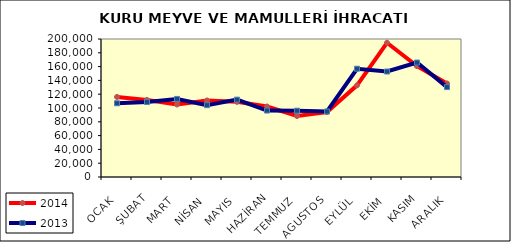
| Category | 2014 | 2013 |
|---|---|---|
| OCAK | 116017.897 | 106856.598 |
| ŞUBAT | 111650.12 | 108712.616 |
| MART | 105105.683 | 113139.691 |
| NİSAN | 110911.075 | 104112.964 |
| MAYIS | 108931.17 | 112100.792 |
| HAZİRAN | 102183.278 | 96319.293 |
| TEMMUZ | 88391.264 | 96080.379 |
| AGUSTOS | 94078.27 | 94981.24 |
| EYLÜL | 132839.611 | 156917.411 |
| EKİM | 194561.579 | 152872.732 |
| KASIM | 160659.845 | 165845.667 |
| ARALIK | 135546.687 | 130314.313 |